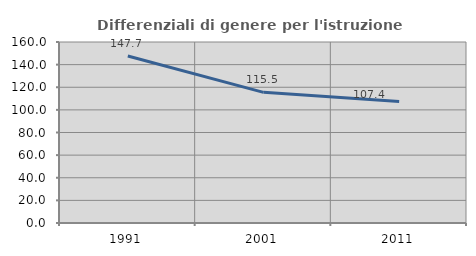
| Category | Differenziali di genere per l'istruzione superiore |
|---|---|
| 1991.0 | 147.667 |
| 2001.0 | 115.509 |
| 2011.0 | 107.369 |